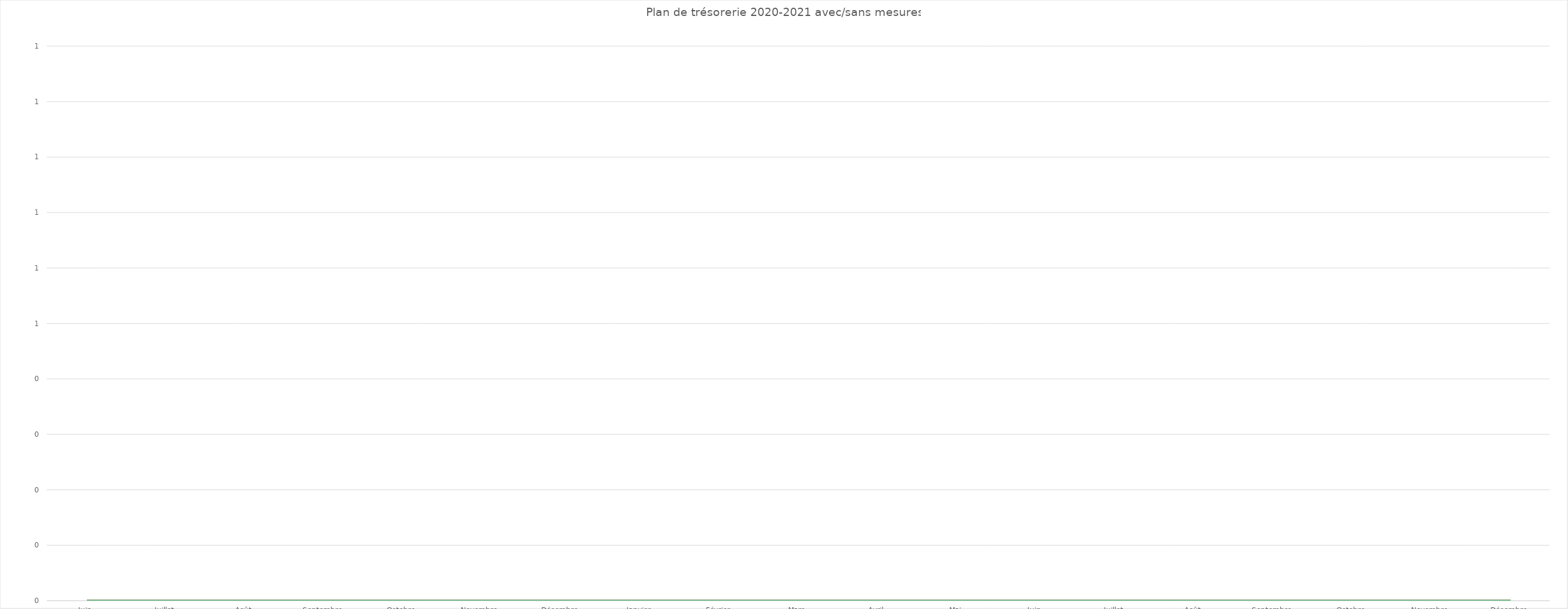
| Category | Solde de tréso fin de mois avant mesures | Solde de tréso fin de mois après mesures |
|---|---|---|
| Juin | 0 | 0 |
| Juillet | 0 | 0 |
| Août | 0 | 0 |
| Septembre | 0 | 0 |
| Octobre  | 0 | 0 |
| Novembre  | 0 | 0 |
| Décembre | 0 | 0 |
| Janvier | 0 | 0 |
| Février | 0 | 0 |
| Mars | 0 | 0 |
| Avril | 0 | 0 |
| Mai | 0 | 0 |
| Juin | 0 | 0 |
| Juillet | 0 | 0 |
| Août | 0 | 0 |
| Septembre | 0 | 0 |
| Octobre | 0 | 0 |
| Novembre | 0 | 0 |
| Décembre | 0 | 0 |